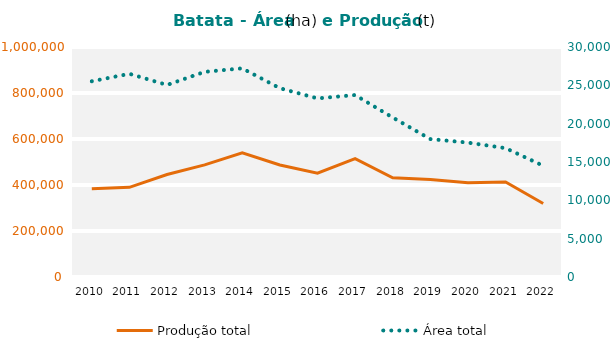
| Category | Produção total |
|---|---|
| 2010 | 383835 |
| 2011 | 389799 |
| 2012 | 445649 |
| 2013 | 487646 |
| 2014 | 539873 |
| 2015 | 486790 |
| 2016 | 451041 |
| 2017 | 515030 |
| 2018 | 431686 |
| 2019 | 424294 |
| 2020 | 409642 |
| 2021 | 413323 |
| 2022 | 319833 |